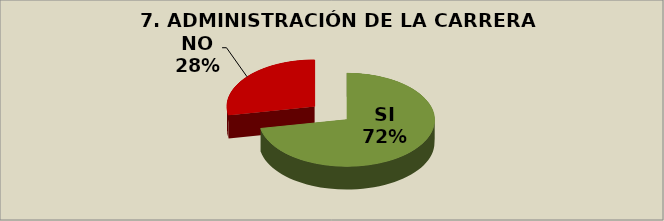
| Category | Series 0 |
|---|---|
| SI | 0.72 |
| NO | 0.28 |